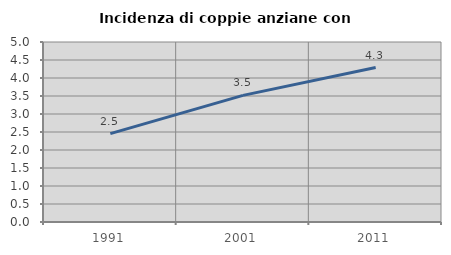
| Category | Incidenza di coppie anziane con figli |
|---|---|
| 1991.0 | 2.455 |
| 2001.0 | 3.518 |
| 2011.0 | 4.29 |